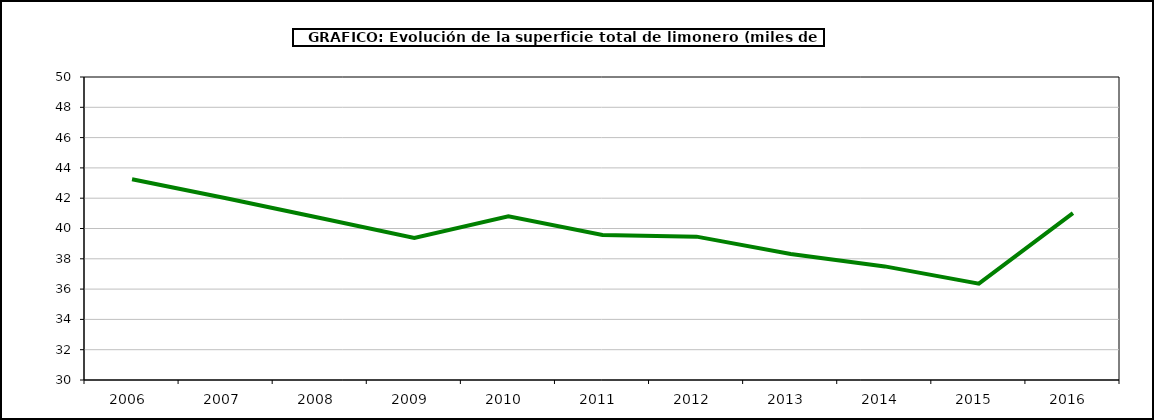
| Category | superficie |
|---|---|
| 2006.0 | 43.247 |
| 2007.0 | 41.996 |
| 2008.0 | 40.689 |
| 2009.0 | 39.371 |
| 2010.0 | 40.801 |
| 2011.0 | 39.571 |
| 2012.0 | 39.463 |
| 2013.0 | 38.319 |
| 2014.0 | 37.498 |
| 2015.0 | 36.363 |
| 2016.0 | 41.009 |